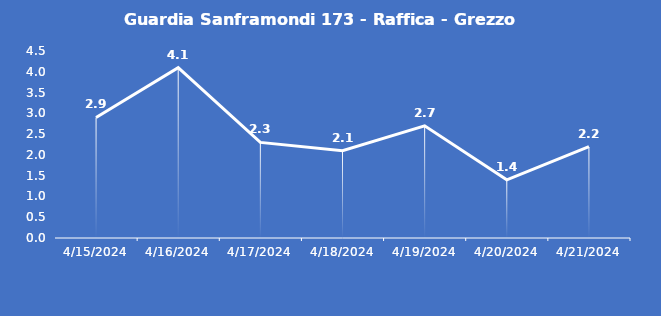
| Category | Guardia Sanframondi 173 - Raffica - Grezzo (m/s) |
|---|---|
| 4/15/24 | 2.9 |
| 4/16/24 | 4.1 |
| 4/17/24 | 2.3 |
| 4/18/24 | 2.1 |
| 4/19/24 | 2.7 |
| 4/20/24 | 1.4 |
| 4/21/24 | 2.2 |